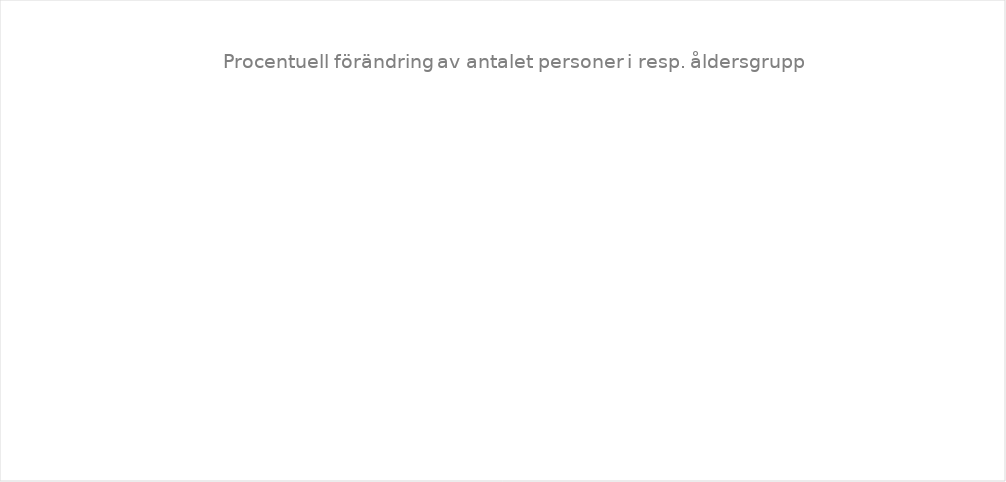
| Category |  0 -19 år |  20 -67 år |  68 -79 år |  80 + |
|---|---|---|---|---|
| Summa | 0.062 | 0.02 | -0.175 | 0.562 |